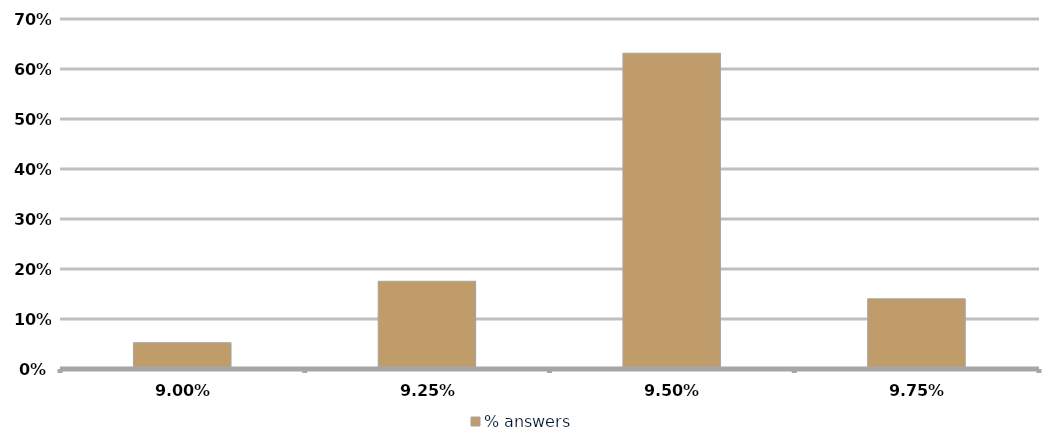
| Category | % answers |
|---|---|
| 0.09 | 0.053 |
| 0.0925 | 0.175 |
| 0.095 | 0.632 |
| 0.0975 | 0.14 |